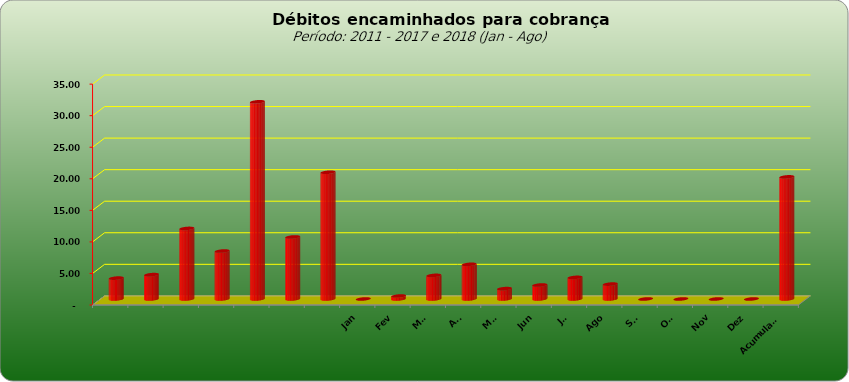
| Category |  3.309.443,02  |
|---|---|
|  | 3309443.02 |
|  | 3859728.44 |
|  | 11181928.25 |
|  | 7600526.01 |
|  | 31248623.5 |
|  | 9830198.34 |
|  | 20083556.95 |
| Jan | 0 |
| Fev | 468831.1 |
| Mar | 3741527.45 |
| Abr | 5493663.59 |
| Mai | 1643658.45 |
| Jun | 2215524.43 |
| Jul | 3425456.07 |
| Ago | 2362409.7 |
| Set | 0 |
| Out | 0 |
| Nov | 0 |
| Dez | 0 |
| Acumulado | 19351070.79 |